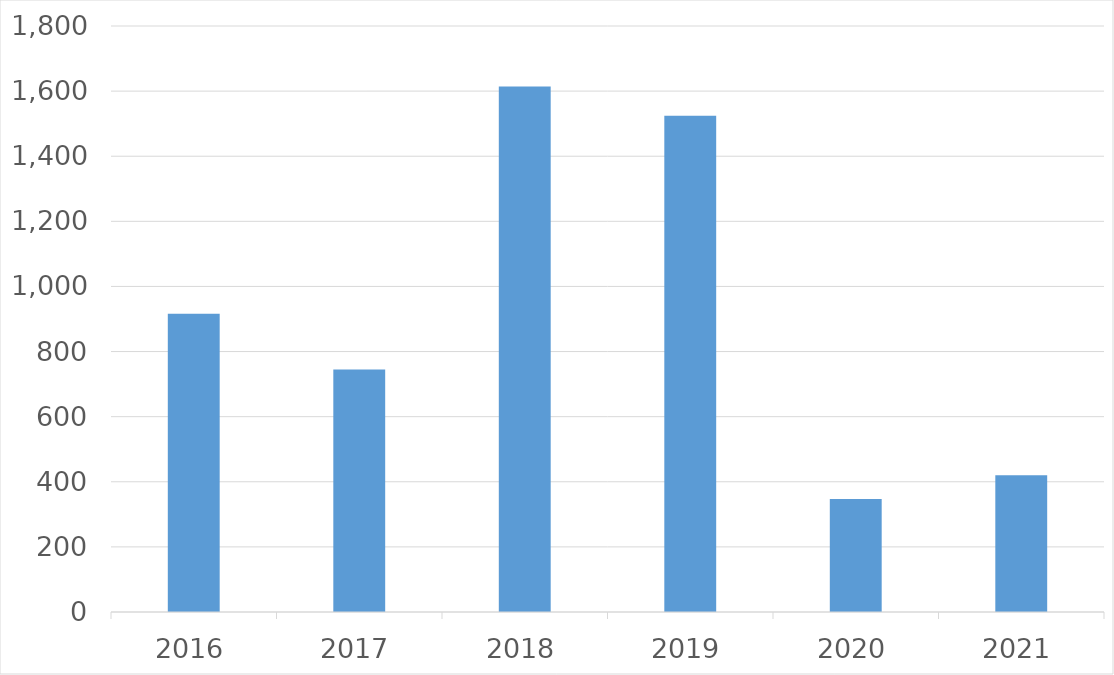
| Category | Series 0 |
|---|---|
| 2016 | 916 |
| 2017 | 745 |
| 2018 | 1614 |
| 2019 | 1524 |
| 2020 | 347 |
| 2021 | 420 |